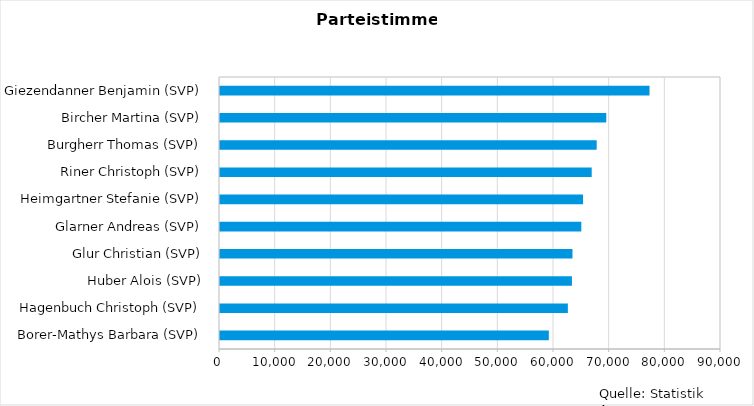
| Category | Series 0 |
|---|---|
| Giezendanner Benjamin (SVP) | 77160 |
| Bircher Martina (SVP) | 69390 |
| Burgherr Thomas (SVP) | 67668 |
| Riner Christoph (SVP) | 66773 |
| Heimgartner Stefanie (SVP) | 65221 |
| Glarner Andreas (SVP) | 64907 |
| Glur Christian (SVP) | 63319 |
| Huber Alois (SVP) | 63225 |
| Hagenbuch Christoph (SVP) | 62491 |
| Borer-Mathys Barbara (SVP) | 59071 |